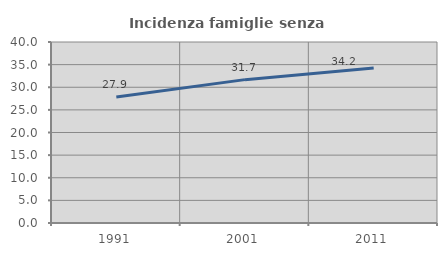
| Category | Incidenza famiglie senza nuclei |
|---|---|
| 1991.0 | 27.858 |
| 2001.0 | 31.683 |
| 2011.0 | 34.232 |